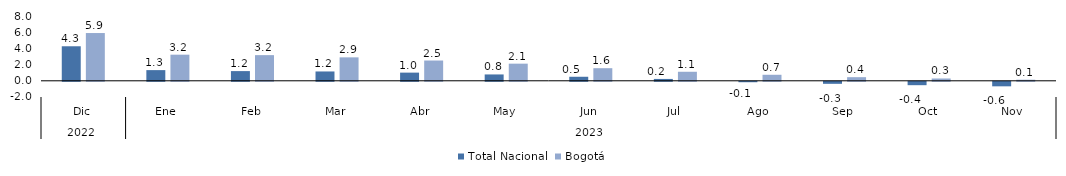
| Category | Total Nacional | Bogotá |
|---|---|---|
| 0 | 4.263 | 5.896 |
| 1 | 1.319 | 3.225 |
| 2 | 1.197 | 3.168 |
| 3 | 1.153 | 2.894 |
| 4 | 1.01 | 2.504 |
| 5 | 0.785 | 2.117 |
| 6 | 0.498 | 1.556 |
| 7 | 0.231 | 1.115 |
| 8 | -0.053 | 0.743 |
| 9 | -0.251 | 0.447 |
| 10 | -0.418 | 0.286 |
| 11 | -0.559 | 0.133 |